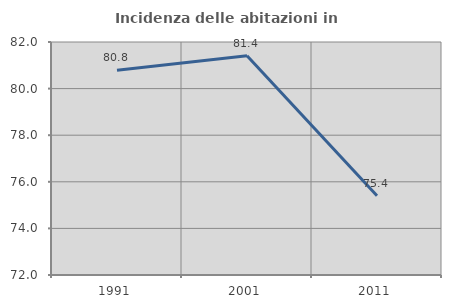
| Category | Incidenza delle abitazioni in proprietà  |
|---|---|
| 1991.0 | 80.786 |
| 2001.0 | 81.409 |
| 2011.0 | 75.397 |